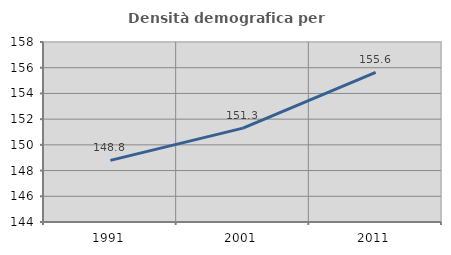
| Category | Densità demografica |
|---|---|
| 1991.0 | 148.791 |
| 2001.0 | 151.303 |
| 2011.0 | 155.634 |